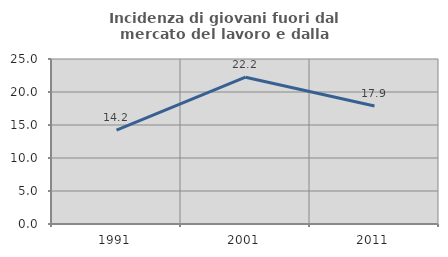
| Category | Incidenza di giovani fuori dal mercato del lavoro e dalla formazione  |
|---|---|
| 1991.0 | 14.227 |
| 2001.0 | 22.242 |
| 2011.0 | 17.869 |